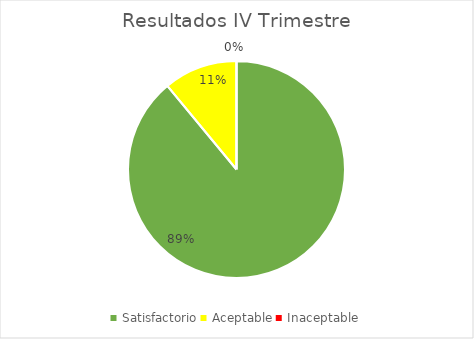
| Category | Series 0 | Series 1 |
|---|---|---|
| Satisfactorio | 0.89 | 0.89 |
| Aceptable | 0.11 | 0.11 |
| Inaceptable | 0 | 0 |